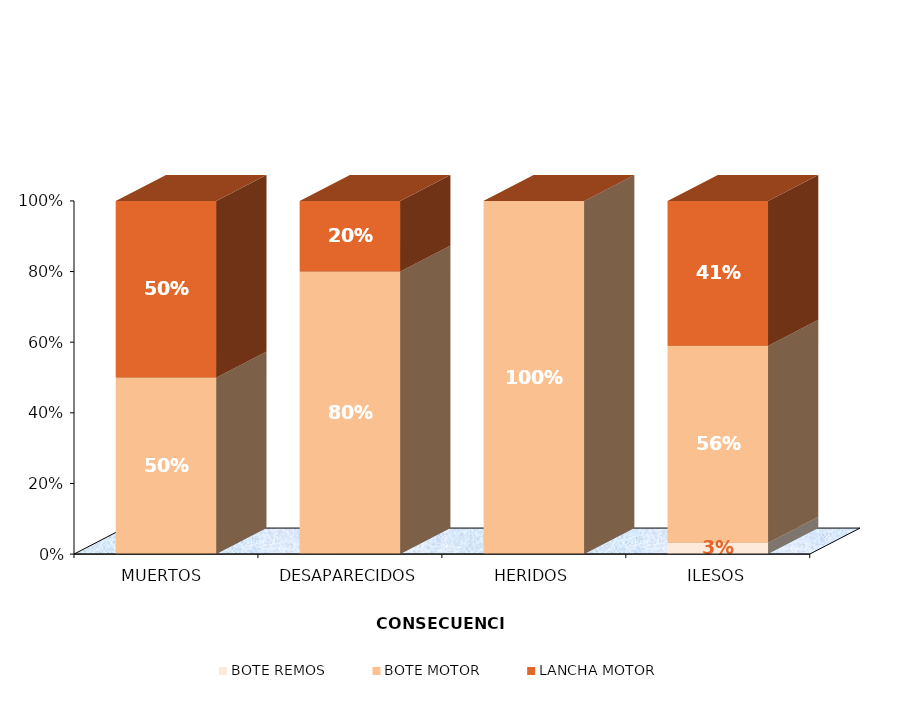
| Category | BOTE REMOS | BOTE MOTOR | LANCHA MOTOR |
|---|---|---|---|
| MUERTOS  | 0 | 0.5 | 0.5 |
| DESAPARECIDOS | 0 | 0.8 | 0.2 |
| HERIDOS | 0 | 1 | 0 |
| ILESOS | 0.032 | 0.558 | 0.41 |